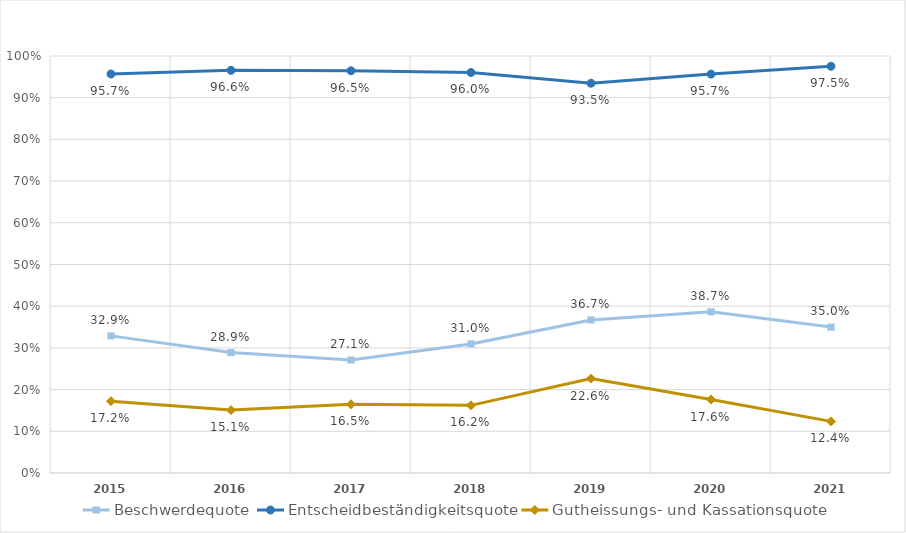
| Category | Beschwerdequote | Entscheidbeständigkeitsquote | Gutheissungs- und Kassationsquote |
|---|---|---|---|
| 2015.0 | 0.329 | 0.957 | 0.172 |
| 2016.0 | 0.289 | 0.966 | 0.151 |
| 2017.0 | 0.271 | 0.965 | 0.165 |
| 2018.0 | 0.31 | 0.96 | 0.162 |
| 2019.0 | 0.367 | 0.935 | 0.226 |
| 2020.0 | 0.387 | 0.957 | 0.176 |
| 2021.0 | 0.35 | 0.975 | 0.124 |